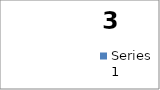
| Category | Series 0 |
|---|---|
| А | 159 |
| Б | 1 |
| В | 4 |